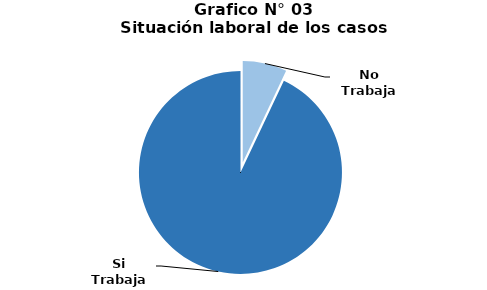
| Category | Series 0 |
|---|---|
| No Trabaja | 136 |
| Si Trabaja | 1799 |